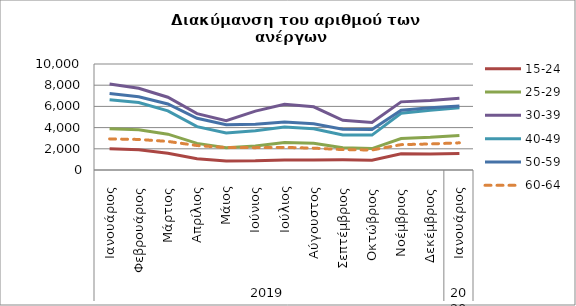
| Category | 15-24 | 25-29 | 30-39 | 40-49 | 50-59 | 60-64 |
|---|---|---|---|---|---|---|
| 0 | 2002 | 3885 | 8112 | 6617 | 7210 | 2934 |
| 1 | 1908 | 3792 | 7715 | 6361 | 6904 | 2883 |
| 2 | 1583 | 3382 | 6867 | 5573 | 6230 | 2696 |
| 3 | 1065 | 2512 | 5317 | 4088 | 4875 | 2307 |
| 4 | 855 | 2089 | 4649 | 3486 | 4277 | 2115 |
| 5 | 865 | 2260 | 5554 | 3710 | 4325 | 2110 |
| 6 | 937 | 2588 | 6199 | 4067 | 4524 | 2132 |
| 7 | 950 | 2528 | 5962 | 3895 | 4356 | 2062 |
| 8 | 960 | 2109 | 4687 | 3310 | 3846 | 1924 |
| 9 | 919 | 2022 | 4478 | 3293 | 3811 | 1886 |
| 10 | 1537 | 2970 | 6427 | 5355 | 5640 | 2393 |
| 11 | 1503 | 3082 | 6550 | 5646 | 5873 | 2456 |
| 12 | 1553 | 3257 | 6759 | 5874 | 6042 | 2564 |